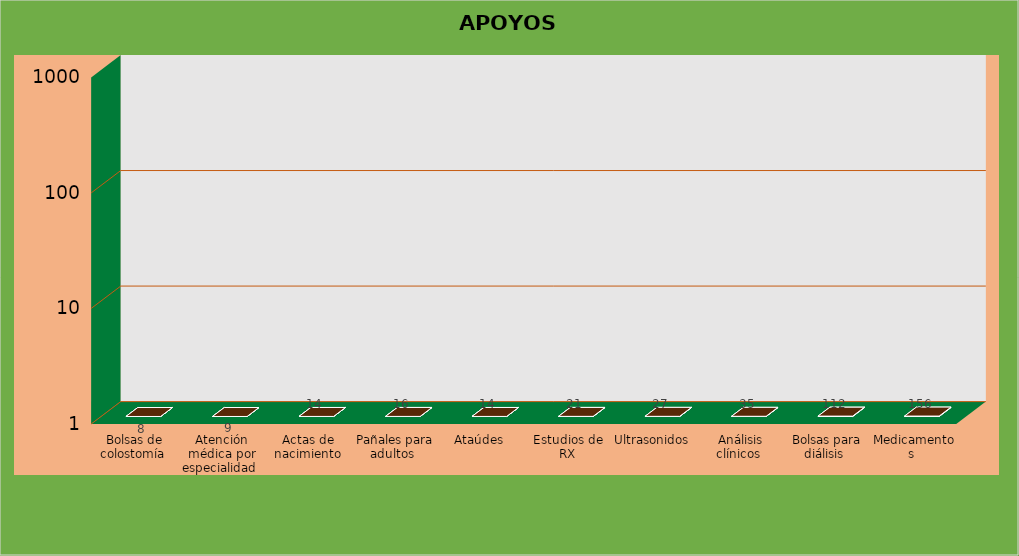
| Category | Series 0 |
|---|---|
| Bolsas de colostomía  | 8 |
| Atención médica por especialidad  | 9 |
| Actas de nacimiento | 14 |
| Pañales para adultos  | 16 |
| Ataúdes | 14 |
| Estudios de RX | 21 |
| Ultrasonidos | 27 |
| Análisis clínicos  | 35 |
| Bolsas para diálisis  | 112 |
| Medicamentos  | 156 |